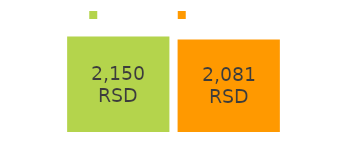
| Category | prihodi | rashodi |
|---|---|---|
| priliv novca: | 2150 | 2081 |